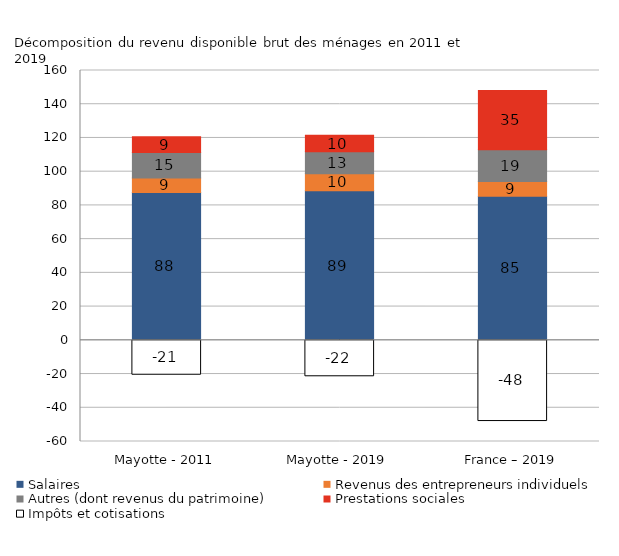
| Category | Salaires | Revenus des entrepreneurs individuels | Autres (dont revenus du patrimoine) | Prestations sociales | Impôts et cotisations |
|---|---|---|---|---|---|
| Mayotte - 2011 | 87.705 | 8.574 | 15.105 | 9.321 | -20.706 |
| Mayotte - 2019 | 88.662 | 10.082 | 13.015 | 9.866 | -21.625 |
| France – 2019 | 85.457 | 8.671 | 18.916 | 35.129 | -48.172 |